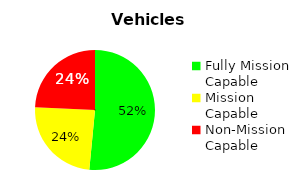
| Category | Series 0 |
|---|---|
| Fully Mission Capable | 17 |
| Mission Capable | 8 |
| Non-Mission Capable | 8 |